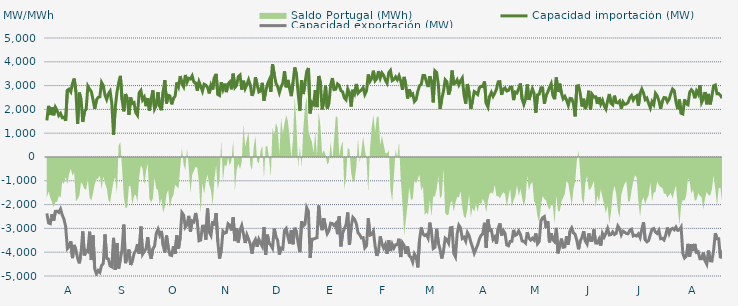
| Category | Capacidad importación (MW) | Capacidad exportación (MW) |
|---|---|---|
| 0 | 1537.5 | -2371.875 |
| 1900-01-01 | 2149.292 | -2771.25 |
| 1900-01-02 | 1766.25 | -2801.25 |
| 1900-01-03 | 2097.75 | -2405.625 |
| 1900-01-04 | 1753.125 | -2676.75 |
| 1900-01-05 | 2090.625 | -2285.292 |
| 1900-01-06 | 1956.125 | -2274.75 |
| 1900-01-07 | 1743.75 | -2330.125 |
| 1900-01-08 | 1833.75 | -2185.875 |
| 1900-01-09 | 1651.875 | -2439.375 |
| 1900-01-10 | 1677 | -2608.125 |
| 1900-01-11 | 1526.25 | -2926.875 |
| 1900-01-12 | 2806.875 | -3847.5 |
| 1900-01-13 | 2853.75 | -3770.625 |
| 1900-01-14 | 2739.375 | -3542.5 |
| 1900-01-15 | 3086.25 | -4248.75 |
| 1900-01-16 | 3294.375 | -3694.583 |
| 1900-01-17 | 2737.5 | -3914.167 |
| 1900-01-18 | 1388.958 | -4258.125 |
| 1900-01-19 | 2705.625 | -4468.125 |
| 1900-01-20 | 2414.25 | -4032.292 |
| 1900-01-21 | 1474.5 | -3127.5 |
| 1900-01-22 | 1904.833 | -4134.375 |
| 1900-01-23 | 2018.333 | -3933.75 |
| 1900-01-24 | 2978.625 | -3980.625 |
| 1900-01-25 | 2851.875 | -3137.917 |
| 1900-01-26 | 2745 | -4327.5 |
| 1900-01-27 | 2411.25 | -3294.375 |
| 1900-01-28 | 2032.5 | -4693.125 |
| 1900-01-29 | 2394.375 | -4916.25 |
| 1900-01-30 | 2506.875 | -4770 |
| 1900-01-31 | 2527.5 | -4845 |
| 1900-02-01 | 3132.875 | -4556.25 |
| 1900-02-02 | 3001.875 | -4479.375 |
| 1900-02-03 | 2597 | -3253.75 |
| 1900-02-04 | 2415.833 | -4258.125 |
| 1900-02-05 | 2655 | -4284.375 |
| 1900-02-06 | 2764.458 | -4576.875 |
| 1900-02-07 | 2248.625 | -4616.25 |
| 1900-02-08 | 931.875 | -3396.042 |
| 1900-02-09 | 2074.792 | -4740 |
| 1900-02-10 | 2707.5 | -3624.375 |
| 1900-02-11 | 3118.125 | -4681.875 |
| 1900-02-12 | 3408.75 | -4280.625 |
| 1900-02-13 | 2415 | -3889.583 |
| 1900-02-14 | 1918.917 | -2840.25 |
| 1900-02-15 | 2645.125 | -4460.625 |
| 1900-02-16 | 2469.792 | -4186.875 |
| 1900-02-17 | 1772.542 | -3887.917 |
| 1900-02-18 | 2498.667 | -4538.125 |
| 1900-02-19 | 2245.542 | -4370 |
| 1900-02-20 | 2285.625 | -4056.25 |
| 1900-02-21 | 1862.708 | -3941.667 |
| 1900-02-22 | 1755.417 | -3663.125 |
| 1900-02-23 | 2699.583 | -4063.125 |
| 1900-02-24 | 2797.5 | -2925.625 |
| 1900-02-25 | 2403.333 | -4085.625 |
| 1900-02-26 | 2516.25 | -3971.25 |
| 1900-02-27 | 2135.625 | -3854.792 |
| 1900-02-28 | 2477.125 | -3369.292 |
| 1900-02-28 | 1956.292 | -3999.375 |
| 1900-03-01 | 2427.5 | -4280 |
| 1900-03-02 | 2798 | -3856.875 |
| 1900-03-03 | 2018.125 | -3744.583 |
| 1900-03-04 | 2168.958 | -3208.75 |
| 1900-03-05 | 2728.125 | -3034.375 |
| 1900-03-06 | 2131.75 | -3278.125 |
| 1900-03-07 | 1966.875 | -3106.458 |
| 1900-03-08 | 2738.083 | -3703.375 |
| 1900-03-09 | 3229.167 | -4012.5 |
| 1900-03-10 | 2249.792 | -3300.833 |
| 1900-03-11 | 2592.917 | -3809.792 |
| 1900-03-12 | 2566.25 | -4116.667 |
| 1900-03-13 | 2212.5 | -4138.708 |
| 1900-03-14 | 2464.375 | -3755.833 |
| 1900-03-15 | 2551.042 | -4061.25 |
| 1900-03-16 | 3133.5 | -3295.833 |
| 1900-03-17 | 2953.75 | -3854.167 |
| 1900-03-18 | 3401.25 | -3375.917 |
| 1900-03-19 | 3082.5 | -2336.25 |
| 1900-03-20 | 2949.375 | -2439.375 |
| 1900-03-21 | 3446.25 | -2947.5 |
| 1900-03-22 | 3138.75 | -2840.625 |
| 1900-03-23 | 3305 | -2472.958 |
| 1900-03-24 | 3276.125 | -3134.625 |
| 1900-03-25 | 3410.625 | -2685.417 |
| 1900-03-26 | 3153.75 | -2727.292 |
| 1900-03-27 | 3110.625 | -2351.25 |
| 1900-03-28 | 2786.458 | -2737.5 |
| 1900-03-29 | 3159.375 | -3519.375 |
| 1900-03-30 | 2974.6 | -3488.4 |
| 1900-03-31 | 2766.667 | -2906.917 |
| 1900-04-01 | 3058.125 | -2902.5 |
| 1900-04-02 | 3018.75 | -3474.375 |
| 1900-04-03 | 2925.625 | -2158.375 |
| 1900-04-04 | 2670.667 | -3157.5 |
| 1900-04-05 | 3015 | -3296.25 |
| 1900-04-06 | 2835.25 | -2693.125 |
| 1900-04-07 | 3337.5 | -2882.083 |
| 1900-04-08 | 3493.125 | -2358.75 |
| 1900-04-09 | 2626.042 | -3555 |
| 1900-04-10 | 2583.542 | -4267.5 |
| 1900-04-11 | 3140.625 | -3948.75 |
| 1900-04-12 | 2844.375 | -3122.5 |
| 1900-04-13 | 3082.5 | -3200.625 |
| 1900-04-14 | 2726.25 | -3170.625 |
| 1900-04-15 | 3071.25 | -2806.875 |
| 1900-04-16 | 3151.875 | -2865 |
| 1900-04-17 | 2845.417 | -3084.375 |
| 1900-04-18 | 3500.625 | -2536.875 |
| 1900-04-19 | 2921.75 | -3531.625 |
| 1900-04-20 | 3012.625 | -2985.75 |
| 1900-04-21 | 3378.75 | -3590.625 |
| 1900-04-22 | 3442.5 | -3078.75 |
| 1900-04-23 | 2829.167 | -2881.042 |
| 1900-04-24 | 3205.833 | -3234.375 |
| 1900-04-25 | 2873.625 | -3613.125 |
| 1900-04-26 | 3038.333 | -3270 |
| 1900-04-27 | 3245.625 | -3459.375 |
| 1900-04-28 | 3029.167 | -3656.25 |
| 1900-04-29 | 2571.042 | -4057.5 |
| 1900-04-30 | 2766.125 | -3596.417 |
| 1900-05-01 | 3348.75 | -3465 |
| 1900-05-02 | 3046.333 | -3774.375 |
| 1900-05-03 | 2732.708 | -3460.042 |
| 1900-05-04 | 2770.75 | -3616.875 |
| 1900-05-05 | 3116.25 | -3757.75 |
| 1900-05-06 | 2370.5 | -2949.375 |
| 1900-05-07 | 2758.625 | -4102.5 |
| 1900-05-08 | 3054.167 | -3262.5 |
| 1900-05-09 | 3221.875 | -3637.5 |
| 1900-05-10 | 2734.792 | -3695.625 |
| 1900-05-11 | 3901.875 | -3830.625 |
| 1900-05-12 | 3478.125 | -3007.5 |
| 1900-05-13 | 3100.208 | -3343.125 |
| 1900-05-14 | 2951.458 | -3500.625 |
| 1900-05-15 | 2703.125 | -4100.625 |
| 1900-05-16 | 2949.667 | -3832.5 |
| 1900-05-17 | 3092.292 | -3864.375 |
| 1900-05-18 | 3609.375 | -3088.125 |
| 1900-05-19 | 2928.75 | -3003.75 |
| 1900-05-20 | 3238.333 | -3346.875 |
| 1900-05-21 | 2865.417 | -3639.375 |
| 1900-05-22 | 2557.917 | -3067.5 |
| 1900-05-23 | 3131.667 | -3665.625 |
| 1900-05-24 | 3761.25 | -2973.625 |
| 1900-05-25 | 3468.542 | -3153.75 |
| 1900-05-26 | 2673.75 | -3622.5 |
| 1900-05-27 | 1945.625 | -3999.375 |
| 1900-05-28 | 3222.083 | -2703.875 |
| 1900-05-29 | 2645.458 | -2900.625 |
| 1900-05-30 | 3097.5 | -2827.5 |
| 1900-05-31 | 3595.208 | -2128.75 |
| 1900-06-01 | 3741.458 | -2283.75 |
| 1900-06-02 | 1833.125 | -4242.5 |
| 1900-06-03 | 2294.25 | -3457.125 |
| 1900-06-04 | 2210.833 | -3444.375 |
| 1900-06-05 | 2808.75 | -3420 |
| 1900-06-06 | 2098.083 | -3391.875 |
| 1900-06-07 | 3404.792 | -2041.875 |
| 1900-06-08 | 3136.875 | -2790.292 |
| 1900-06-09 | 2001.25 | -3075.75 |
| 1900-06-10 | 2334.583 | -2570.625 |
| 1900-06-11 | 2998.542 | -2932.5 |
| 1900-06-12 | 2041.583 | -3219.375 |
| 1900-06-13 | 2261.875 | -3091.875 |
| 1900-06-14 | 3017.292 | -2780.625 |
| 1900-06-15 | 3316.667 | -2796 |
| 1900-06-16 | 2831.875 | -2880.375 |
| 1900-06-17 | 2848.875 | -2791.375 |
| 1900-06-18 | 3072.083 | -3242.5 |
| 1900-06-19 | 3008.75 | -2494.125 |
| 1900-06-20 | 2789.75 | -3753.75 |
| 1900-06-21 | 2740.75 | -3208.125 |
| 1900-06-22 | 2484.167 | -3015 |
| 1900-06-23 | 2405.083 | -2845.208 |
| 1900-06-24 | 2862.542 | -2330.625 |
| 1900-06-25 | 2704.875 | -3693.75 |
| 1900-06-26 | 2121.458 | -2932.25 |
| 1900-06-27 | 2826.875 | -2536.458 |
| 1900-06-28 | 2666.25 | -2617.875 |
| 1900-06-29 | 3068.375 | -2797.625 |
| 1900-06-30 | 2681.458 | -3181.875 |
| 1900-07-01 | 2762.167 | -3268.125 |
| 1900-07-02 | 2816.458 | -3403.125 |
| 1900-07-03 | 2908.75 | -3388.125 |
| 1900-07-04 | 2628.458 | -3817.5 |
| 1900-07-05 | 2784.5 | -3729.375 |
| 1900-07-06 | 3466.875 | -2575.375 |
| 1900-07-07 | 3180 | -3284.375 |
| 1900-07-08 | 3301.25 | -3251.25 |
| 1900-07-09 | 3624.375 | -3114.375 |
| 1900-07-10 | 3203.333 | -3733.125 |
| 1900-07-11 | 3288.125 | -4155 |
| 1900-07-12 | 3606.25 | -3943.125 |
| 1900-07-13 | 3313.75 | -3335.625 |
| 1900-07-14 | 3531.417 | -3646.875 |
| 1900-07-15 | 3433.125 | -3826.875 |
| 1900-07-16 | 3223.542 | -3673.333 |
| 1900-07-17 | 3103.75 | -4066.875 |
| 1900-07-18 | 3546.25 | -3496.875 |
| 1900-07-19 | 3638.5 | -3952.5 |
| 1900-07-20 | 3210 | -3661.875 |
| 1900-07-21 | 3255.417 | -3826.875 |
| 1900-07-22 | 3367.5 | -3690 |
| 1900-07-23 | 3244.5 | -3684.375 |
| 1900-07-24 | 3411.458 | -3435 |
| 1900-07-25 | 3192.708 | -4203.75 |
| 1900-07-26 | 2825 | -3605.625 |
| 1900-07-27 | 3365.667 | -3718.625 |
| 1900-07-28 | 3014.375 | -4063.125 |
| 1900-07-29 | 2458.292 | -3762 |
| 1900-07-30 | 2845.5 | -4151.25 |
| 1900-07-31 | 2597.292 | -4215 |
| 1900-08-01 | 2650.375 | -4415.625 |
| 1900-08-02 | 2331.042 | -4066.875 |
| 1900-08-03 | 2415.625 | -4185 |
| 1900-08-04 | 2763.875 | -4638.75 |
| 1900-08-05 | 2996.042 | -3465 |
| 1900-08-06 | 3054.375 | -2960.625 |
| 1900-08-07 | 3421.875 | -3238.875 |
| 1900-08-08 | 3422.25 | -3301.458 |
| 1900-08-09 | 3168.75 | -3257.708 |
| 1900-08-10 | 2940.75 | -3407.5 |
| 1900-08-11 | 3391.875 | -2758.75 |
| 1900-08-12 | 3159.375 | -3175.208 |
| 1900-08-13 | 2294.792 | -3843.75 |
| 1900-08-14 | 3620.625 | -3793.125 |
| 1900-08-15 | 3550.208 | -3016.875 |
| 1900-08-16 | 3036.458 | -3616.875 |
| 1900-08-17 | 2023.333 | -3886.25 |
| 1900-08-18 | 2440.208 | -4263.75 |
| 1900-08-19 | 2764.167 | -3943.125 |
| 1900-08-20 | 3245.625 | -3410.667 |
| 1900-08-21 | 3161.25 | -3470.625 |
| 1900-08-22 | 2621.458 | -3614.625 |
| 1900-08-23 | 2861.25 | -2975.958 |
| 1900-08-24 | 3635.217 | -2962.391 |
| 1900-08-25 | 3071.083 | -4052.75 |
| 1900-08-26 | 3103.625 | -4196.25 |
| 1900-08-27 | 3238.125 | -3235.75 |
| 1900-08-28 | 3031.875 | -2868.708 |
| 1900-08-29 | 3202.5 | -2981.292 |
| 1900-08-30 | 3320.625 | -3422.292 |
| 1900-08-31 | 2615.625 | -3370.417 |
| 1900-09-01 | 2244.375 | -3535.625 |
| 1900-09-02 | 3067.5 | -3176.25 |
| 1900-09-03 | 2692.458 | -3306.875 |
| 1900-09-04 | 2025 | -3576.042 |
| 1900-09-05 | 2373.833 | -3795 |
| 1900-09-06 | 2750.458 | -4045 |
| 1900-09-07 | 2704.167 | -3868.417 |
| 1900-09-08 | 2628.75 | -3691.667 |
| 1900-09-09 | 2910 | -3448.125 |
| 1900-09-10 | 2971.875 | -3293.375 |
| 1900-09-11 | 2958.5 | -3229.167 |
| 1900-09-12 | 3174.375 | -2764.583 |
| 1900-09-13 | 2253.75 | -3813.75 |
| 1900-09-14 | 2100 | -2628.667 |
| 1900-09-15 | 2557.5 | -3088.333 |
| 1900-09-16 | 2713.125 | -3062.25 |
| 1900-09-17 | 2546.875 | -3463.625 |
| 1900-09-18 | 2686.458 | -3359.458 |
| 1900-09-19 | 2850 | -3646.042 |
| 1900-09-20 | 3159.375 | -2992.292 |
| 1900-09-21 | 3166.875 | -2793.125 |
| 1900-09-22 | 2613.75 | -3298.833 |
| 1900-09-23 | 2857.5 | -3089.625 |
| 1900-09-24 | 2903.875 | -3210.125 |
| 1900-09-25 | 2772 | -3696.792 |
| 1900-09-26 | 2797.5 | -3731.25 |
| 1900-09-27 | 2930.625 | -3545.625 |
| 1900-09-28 | 2932.5 | -3541.875 |
| 1900-09-29 | 2390.625 | -3064.167 |
| 1900-09-30 | 2726.25 | -3293.333 |
| 1900-10-01 | 2694.375 | -3252.708 |
| 1900-10-02 | 2878.125 | -3111.875 |
| 1900-10-03 | 3088.125 | -3247.5 |
| 1900-10-04 | 2435.625 | -3528.958 |
| 1900-10-05 | 2206.875 | -3547.708 |
| 1900-10-06 | 2435.625 | -3618.75 |
| 1900-10-07 | 3046.875 | -3157.917 |
| 1900-10-08 | 2400 | -3406.875 |
| 1900-10-09 | 2640 | -3488.125 |
| 1900-10-10 | 2866.875 | -3413.542 |
| 1900-10-11 | 2675.625 | -3486.458 |
| 1900-10-12 | 1861.25 | -3211.667 |
| 1900-10-13 | 2611.875 | -3644.375 |
| 1900-10-14 | 2638.125 | -3547.083 |
| 1900-10-15 | 2906.25 | -2688.333 |
| 1900-10-16 | 2904.375 | -2549.583 |
| 1900-10-17 | 2240.625 | -2502.083 |
| 1900-10-18 | 2576.25 | -2981.667 |
| 1900-10-19 | 2732.25 | -2689.375 |
| 1900-10-20 | 2919.375 | -3586.875 |
| 1900-10-21 | 3078.75 | -3206.25 |
| 1900-10-22 | 2587.5 | -3481.875 |
| 1900-10-23 | 2430 | -3560.625 |
| 1900-10-24 | 3341.25 | -2977.542 |
| 1900-10-25 | 2733.75 | -4046.25 |
| 1900-10-26 | 3080.625 | -3725.417 |
| 1900-10-27 | 2681.25 | -3429.375 |
| 1900-10-28 | 2448.75 | -3793.125 |
| 1900-10-29 | 2544.125 | -3778.125 |
| 1900-10-30 | 2394.958 | -3328.125 |
| 1900-10-31 | 2175 | -3678.75 |
| 1900-11-01 | 2461.167 | -3117.375 |
| 1900-11-02 | 2448.75 | -2981.542 |
| 1900-11-03 | 2255.042 | -3185.833 |
| 1900-11-04 | 1708.042 | -3250.208 |
| 1900-11-05 | 2981.25 | -3508.125 |
| 1900-11-06 | 2998.125 | -3877.5 |
| 1900-11-07 | 2664.375 | -3519.375 |
| 1900-11-08 | 2124.375 | -3382.5 |
| 1900-11-09 | 2446.875 | -3115.792 |
| 1900-11-10 | 2015.417 | -3534.375 |
| 1900-11-11 | 2289.375 | -3658.125 |
| 1900-11-12 | 2784.375 | -3211.083 |
| 1900-11-13 | 1993.125 | -3504.792 |
| 1900-11-14 | 2624.875 | -3506.458 |
| 1900-11-15 | 2523.75 | -3042.583 |
| 1900-11-16 | 2531.25 | -3613.125 |
| 1900-11-17 | 2229.583 | -3620.625 |
| 1900-11-18 | 2515.875 | -3455.625 |
| 1900-11-19 | 2227.5 | -3723.75 |
| 1900-11-20 | 2388.375 | -3217.458 |
| 1900-11-21 | 2157.875 | -3361.542 |
| 1900-11-22 | 2014.583 | -3202.708 |
| 1900-11-23 | 2357.917 | -3006.583 |
| 1900-11-24 | 2647.75 | -3275.625 |
| 1900-11-25 | 2259.375 | -3258.75 |
| 1900-11-26 | 2191.875 | -3148.125 |
| 1900-11-27 | 2578.125 | -3256.875 |
| 1900-11-28 | 2289.375 | -3211.875 |
| 1900-11-29 | 2272.917 | -2898.25 |
| 1900-11-30 | 2349.75 | -3012.25 |
| 1900-12-01 | 2034.167 | -3270 |
| 1900-12-02 | 2319.375 | -3116.25 |
| 1900-12-03 | 2214.375 | -3159.375 |
| 1900-12-04 | 2229.167 | -3217.5 |
| 1900-12-05 | 2296.875 | -3223.125 |
| 1900-12-06 | 2497.5 | -3080.208 |
| 1900-12-07 | 2585.5 | -3034.292 |
| 1900-12-08 | 2394.375 | -3318.75 |
| 1900-12-09 | 2520 | -3286.875 |
| 1900-12-10 | 2570.625 | -3320.625 |
| 1900-12-11 | 2145 | -3229.583 |
| 1900-12-12 | 2673.75 | -3384.375 |
| 1900-12-13 | 2855.625 | -3040.333 |
| 1900-12-14 | 2689.875 | -2741.708 |
| 1900-12-15 | 2413.125 | -3485.625 |
| 1900-12-16 | 2476.875 | -3564.375 |
| 1900-12-17 | 2258.75 | -3510 |
| 1900-12-18 | 2056.875 | -3258.75 |
| 1900-12-19 | 2326.875 | -3036.667 |
| 1900-12-20 | 2203.125 | -3003.75 |
| 1900-12-21 | 2675.333 | -3153.417 |
| 1900-12-22 | 2572.5 | -3211.875 |
| 1900-12-23 | 2368.125 | -3082.917 |
| 1900-12-24 | 2032.5 | -3433.125 |
| 1900-12-25 | 2340 | -3418.125 |
| 1900-12-26 | 2499.375 | -3485.625 |
| 1900-12-27 | 2488.125 | -3277.5 |
| 1900-12-28 | 2317.5 | -2963.167 |
| 1900-12-29 | 2431.875 | -3217.5 |
| 1900-12-30 | 2668.125 | -3039.375 |
| 1900-12-31 | 2855.625 | -2998.125 |
| 1901-01-01 | 2778.75 | -3061.667 |
| 1901-01-02 | 2311.875 | -2941.042 |
| 1901-01-03 | 2010 | -3084.375 |
| 1901-01-04 | 2411.25 | -3065.625 |
| 1901-01-05 | 1837.917 | -2945.625 |
| 1901-01-06 | 1809.167 | -4055.625 |
| 1901-01-07 | 2419.792 | -4241.25 |
| 1901-01-08 | 2227.5 | -4173.75 |
| 1901-01-09 | 2191.875 | -3648.75 |
| 1901-01-10 | 2715 | -4183.125 |
| 1901-01-11 | 2826.625 | -3667.292 |
| 1901-01-12 | 2745 | -3950.625 |
| 1901-01-13 | 2467.5 | -3652.625 |
| 1901-01-14 | 2771.25 | -4006.875 |
| 1901-01-15 | 2640 | -3980.625 |
| 1901-01-16 | 3016.875 | -4271.25 |
| 1901-01-17 | 2292.292 | -4271.25 |
| 1901-01-18 | 2448.75 | -4010.625 |
| 1901-01-19 | 2730 | -4357.5 |
| 1901-01-20 | 2214.75 | -4501.875 |
| 1901-01-21 | 2650.208 | -3931.667 |
| 1901-01-22 | 2212.5 | -4361.25 |
| 1901-01-23 | 2565 | -4370.625 |
| 1901-01-24 | 2988.75 | -3920.625 |
| 1901-01-25 | 3024.375 | -3204.083 |
| 1901-01-26 | 2656.875 | -3437.708 |
| 1901-01-27 | 2664.375 | -3437.5 |
| 1901-01-28 | 2587.5 | -4254.375 |
| 1901-01-29 | 2473.125 | -3939.583 |